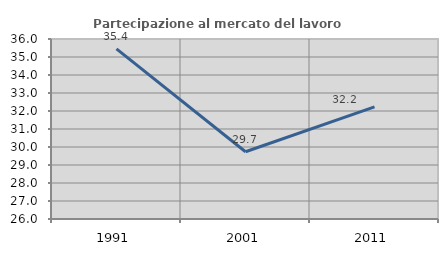
| Category | Partecipazione al mercato del lavoro  femminile |
|---|---|
| 1991.0 | 35.449 |
| 2001.0 | 29.736 |
| 2011.0 | 32.231 |